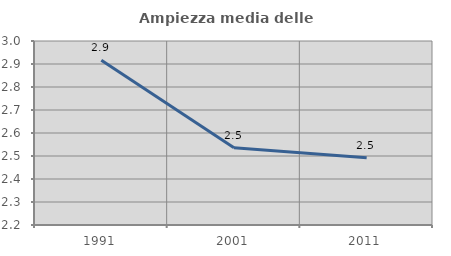
| Category | Ampiezza media delle famiglie |
|---|---|
| 1991.0 | 2.917 |
| 2001.0 | 2.536 |
| 2011.0 | 2.492 |